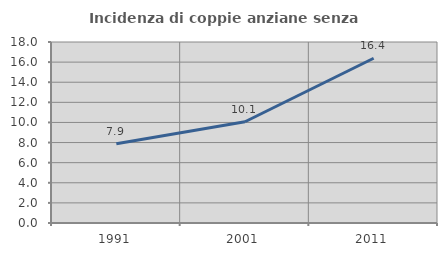
| Category | Incidenza di coppie anziane senza figli  |
|---|---|
| 1991.0 | 7.889 |
| 2001.0 | 10.068 |
| 2011.0 | 16.387 |